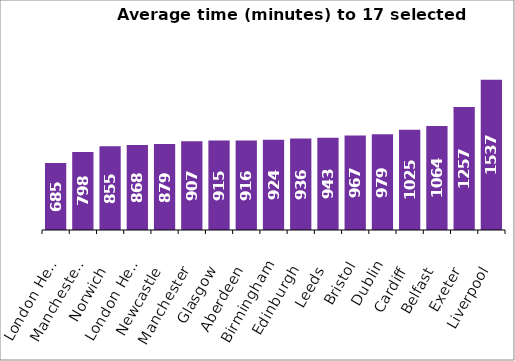
| Category | London Heathrow (fast) Manchester (fast) Norwich London Heathrow Newcastle Manchester Glasgow Aberdeen Birmingham Edinburgh Leeds Bristol Dublin Cardiff Belfast Exeter Liverpool |
|---|---|
| London Heathrow (fast) | 685 |
| Manchester (fast) | 798.111 |
| Norwich | 855.389 |
| London Heathrow | 868.444 |
| Newcastle | 878.556 |
| Manchester | 906.889 |
| Glasgow | 914.722 |
| Aberdeen | 915.944 |
| Birmingham | 923.556 |
| Edinburgh | 936.056 |
| Leeds | 942.556 |
| Bristol | 967.444 |
| Dublin | 978.556 |
| Cardiff | 1024.556 |
| Belfast | 1064.444 |
| Exeter | 1257.444 |
| Liverpool | 1536.833 |